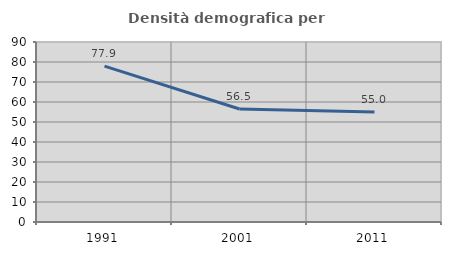
| Category | Densità demografica |
|---|---|
| 1991.0 | 77.905 |
| 2001.0 | 56.494 |
| 2011.0 | 55.042 |